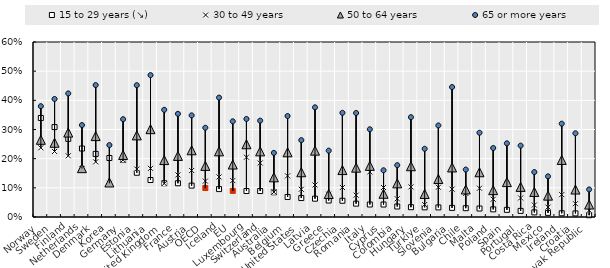
| Category | 15 to 29 years (↘) | 30 to 49 years | 50 to 64 years | 65 or more years |
|---|---|---|---|---|
| Norway | 0.339 | 0.237 | 0.265 | 0.38 |
| Sweden | 0.308 | 0.225 | 0.254 | 0.405 |
| Finland | 0.268 | 0.21 | 0.289 | 0.424 |
| Netherlands | 0.235 | 0.166 | 0.167 | 0.315 |
| Denmark | 0.216 | 0.189 | 0.277 | 0.452 |
| Korea | 0.202 | 0.115 | 0.118 | 0.247 |
| Germany | 0.195 | 0.196 | 0.213 | 0.335 |
| Estonia | 0.152 | 0.165 | 0.28 | 0.452 |
| Lithuania | 0.127 | 0.167 | 0.301 | 0.486 |
| United Kingdom | 0.116 | 0.115 | 0.195 | 0.367 |
| France | 0.116 | 0.144 | 0.209 | 0.354 |
| Austria | 0.108 | 0.16 | 0.229 | 0.348 |
| OECD | 0.099 | 0.123 | 0.175 | 0.306 |
| Iceland | 0.096 | 0.137 | 0.225 | 0.409 |
| EU | 0.09 | 0.125 | 0.18 | 0.328 |
| Luxembourg | 0.089 | 0.205 | 0.249 | 0.336 |
| Switzerland | 0.089 | 0.185 | 0.225 | 0.33 |
| Australia | 0.085 | 0.085 | 0.136 | 0.22 |
| Belgium | 0.069 | 0.141 | 0.222 | 0.346 |
| United States | 0.065 | 0.095 | 0.153 | 0.264 |
| Latvia | 0.063 | 0.11 | 0.227 | 0.376 |
| Greece | 0.056 | 0.078 | 0.079 | 0.228 |
| Czechia | 0.056 | 0.101 | 0.161 | 0.357 |
| Romania | 0.046 | 0.075 | 0.169 | 0.357 |
| Italy | 0.043 | 0.155 | 0.175 | 0.301 |
| Cyprus | 0.043 | 0.101 | 0.08 | 0.16 |
| Colombia | 0.036 | 0.063 | 0.115 | 0.178 |
| Hungary | 0.034 | 0.103 | 0.174 | 0.342 |
| Türkiye | 0.033 | 0.043 | 0.079 | 0.234 |
| Slovenia | 0.033 | 0.102 | 0.13 | 0.314 |
| Bulgaria | 0.031 | 0.095 | 0.17 | 0.446 |
| Chile | 0.03 | 0.081 | 0.094 | 0.163 |
| Malta | 0.029 | 0.099 | 0.153 | 0.289 |
| Poland | 0.026 | 0.061 | 0.092 | 0.237 |
| Spain | 0.025 | 0.115 | 0.12 | 0.253 |
| Portugal | 0.021 | 0.065 | 0.103 | 0.245 |
| Costa Rica | 0.016 | 0.041 | 0.086 | 0.154 |
| Mexico | 0.014 | 0.034 | 0.073 | 0.139 |
| Ireland | 0.013 | 0.077 | 0.196 | 0.32 |
| Croatia | 0.012 | 0.046 | 0.094 | 0.287 |
| Slovak Republic | 0.006 | 0.023 | 0.043 | 0.094 |